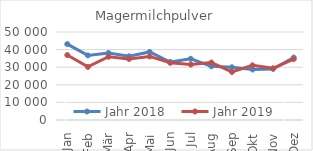
| Category | Jahr 2018 | Jahr 2019 |
|---|---|---|
| Jan | 43124.031 | 36895.374 |
| Feb | 36708.389 | 30164.182 |
| Mär | 38089.48 | 35943.562 |
| Apr | 36211.658 | 34681.542 |
| Mai | 38688.306 | 36116.479 |
| Jun | 32970.127 | 32506.305 |
| Jul | 34754.013 | 31511.896 |
| Aug | 30505.904 | 32656.793 |
| Sep | 29958.739 | 27311.24 |
| Okt | 28688.987 | 31046.562 |
| Nov | 29036.239 | 29365.427 |
| Dez | 35486.902 | 34590.781 |